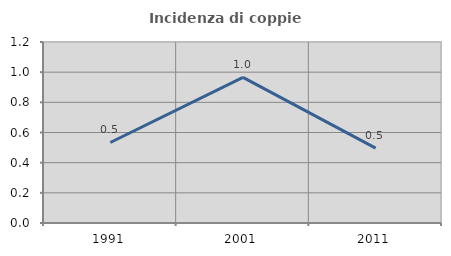
| Category | Incidenza di coppie miste |
|---|---|
| 1991.0 | 0.534 |
| 2001.0 | 0.966 |
| 2011.0 | 0.496 |